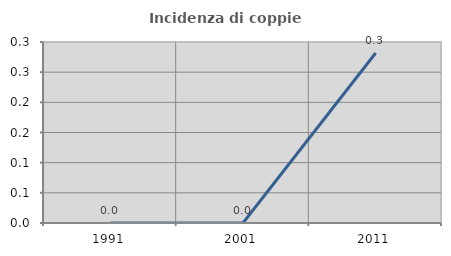
| Category | Incidenza di coppie miste |
|---|---|
| 1991.0 | 0 |
| 2001.0 | 0 |
| 2011.0 | 0.282 |